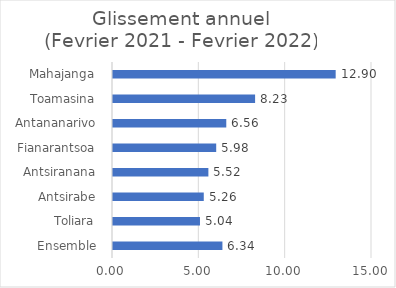
| Category | Glissement Annuel |
|---|---|
|  Ensemble  | 6.337 |
|  Toliara  | 5.037 |
|  Antsirabe  | 5.257 |
|  Antsiranana  | 5.524 |
|  Fianarantsoa  | 5.977 |
|  Antananarivo  | 6.561 |
|  Toamasina  | 8.23 |
|  Mahajanga  | 12.896 |